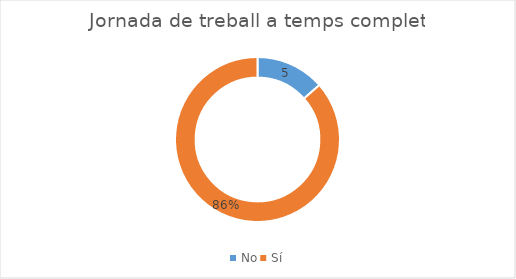
| Category | Series 0 |
|---|---|
| No | 5 |
| Sí | 32 |